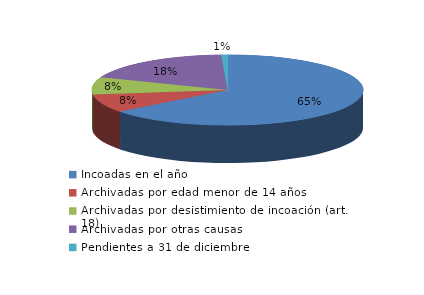
| Category | Series 0 |
|---|---|
| Incoadas en el año | 351 |
| Archivadas por edad menor de 14 años | 46 |
| Archivadas por desistimiento de incoación (art. 18) | 43 |
| Archivadas por otras causas | 100 |
| Pendientes a 31 de diciembre | 4 |